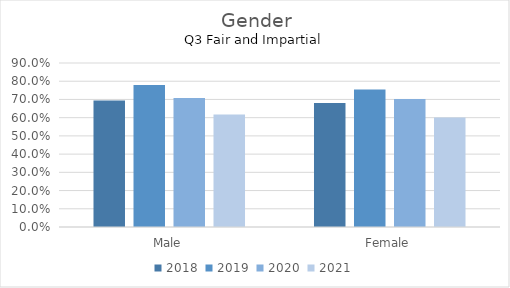
| Category | 2018 | 2019 | 2020 | 2021 |
|---|---|---|---|---|
| Male | 0.694 | 0.779 | 0.708 | 0.617 |
| Female | 0.68 | 0.755 | 0.702 | 0.601 |